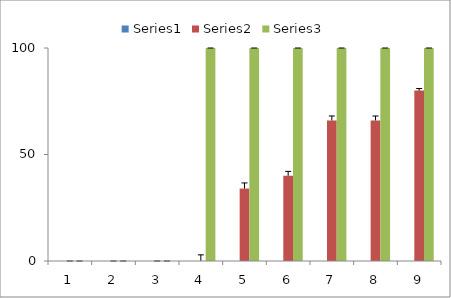
| Category | Series 0 | Series 1 | Series 2 |
|---|---|---|---|
| 0 | 0 | 0 | 0 |
| 1 | 0 | 0 | 0 |
| 2 | 0 | 0 | 0 |
| 3 | 0 | 0 | 100 |
| 4 | 0 | 34 | 100 |
| 5 | 0 | 40 | 100 |
| 6 | 0 | 66 | 100 |
| 7 | 0 | 66 | 100 |
| 8 | 0 | 80 | 100 |